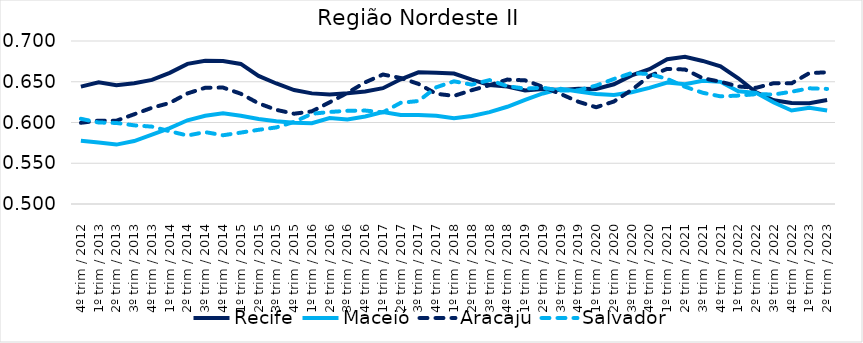
| Category | Recife | Maceió | Aracaju | Salvador |
|---|---|---|---|---|
| 4º trim / 2012 | 0.644 | 0.578 | 0.6 | 0.605 |
| 1º trim / 2013 | 0.649 | 0.575 | 0.602 | 0.6 |
| 2º trim / 2013 | 0.646 | 0.573 | 0.602 | 0.599 |
| 3º trim / 2013 | 0.648 | 0.577 | 0.61 | 0.597 |
| 4º trim / 2013 | 0.652 | 0.585 | 0.618 | 0.595 |
| 1º trim / 2014 | 0.661 | 0.593 | 0.624 | 0.589 |
| 2º trim / 2014 | 0.672 | 0.603 | 0.636 | 0.584 |
| 3º trim / 2014 | 0.676 | 0.608 | 0.643 | 0.588 |
| 4º trim / 2014 | 0.676 | 0.611 | 0.643 | 0.584 |
| 1º trim / 2015 | 0.672 | 0.608 | 0.635 | 0.588 |
| 2º trim / 2015 | 0.657 | 0.604 | 0.624 | 0.591 |
| 3º trim / 2015 | 0.648 | 0.602 | 0.616 | 0.594 |
| 4º trim / 2015 | 0.64 | 0.6 | 0.611 | 0.601 |
| 1º trim / 2016 | 0.636 | 0.599 | 0.614 | 0.611 |
| 2º trim / 2016 | 0.634 | 0.605 | 0.625 | 0.613 |
| 3º trim / 2016 | 0.636 | 0.604 | 0.636 | 0.614 |
| 4º trim / 2016 | 0.638 | 0.607 | 0.649 | 0.615 |
| 1º trim / 2017 | 0.642 | 0.613 | 0.659 | 0.612 |
| 2º trim / 2017 | 0.653 | 0.609 | 0.655 | 0.624 |
| 3º trim / 2017 | 0.662 | 0.609 | 0.647 | 0.626 |
| 4º trim / 2017 | 0.661 | 0.608 | 0.635 | 0.643 |
| 1º trim / 2018 | 0.66 | 0.605 | 0.633 | 0.651 |
| 2º trim / 2018 | 0.653 | 0.608 | 0.64 | 0.646 |
| 3º trim / 2018 | 0.646 | 0.613 | 0.646 | 0.652 |
| 4º trim / 2018 | 0.644 | 0.619 | 0.653 | 0.645 |
| 1º trim / 2019 | 0.639 | 0.628 | 0.652 | 0.642 |
| 2º trim / 2019 | 0.641 | 0.636 | 0.644 | 0.643 |
| 3º trim / 2019 | 0.64 | 0.641 | 0.635 | 0.639 |
| 4º trim / 2019 | 0.641 | 0.638 | 0.625 | 0.64 |
| 1º trim / 2020 | 0.641 | 0.635 | 0.619 | 0.645 |
| 2º trim / 2020 | 0.647 | 0.634 | 0.626 | 0.653 |
| 3º trim / 2020 | 0.658 | 0.637 | 0.64 | 0.661 |
| 4º trim / 2020 | 0.665 | 0.642 | 0.657 | 0.659 |
| 1º trim / 2021 | 0.678 | 0.649 | 0.666 | 0.654 |
| 2º trim / 2021 | 0.681 | 0.647 | 0.665 | 0.644 |
| 3º trim / 2021 | 0.676 | 0.651 | 0.654 | 0.636 |
| 4º trim / 2021 | 0.669 | 0.65 | 0.65 | 0.632 |
| 1º trim / 2022 | 0.654 | 0.638 | 0.644 | 0.633 |
| 2º trim / 2022 | 0.637 | 0.636 | 0.643 | 0.635 |
| 3º trim / 2022 | 0.627 | 0.624 | 0.648 | 0.634 |
| 4º trim / 2022 | 0.624 | 0.615 | 0.648 | 0.638 |
| 1º trim / 2023 | 0.624 | 0.618 | 0.661 | 0.642 |
| 2º trim / 2023 | 0.628 | 0.615 | 0.662 | 0.641 |